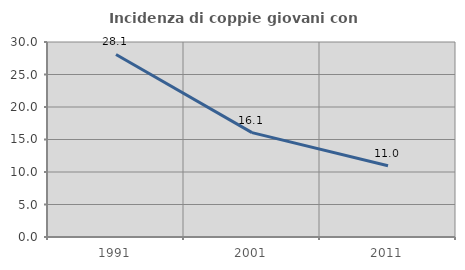
| Category | Incidenza di coppie giovani con figli |
|---|---|
| 1991.0 | 28.08 |
| 2001.0 | 16.052 |
| 2011.0 | 10.953 |